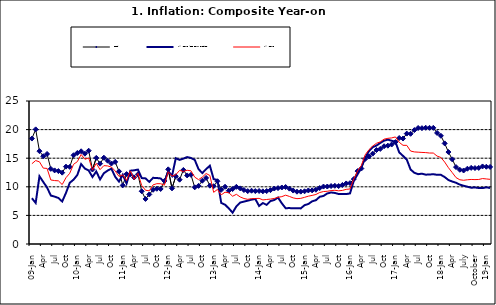
| Category | Food | All Items less Farm Produce | All Items |
|---|---|---|---|
| 09-Jan | 18.436 | 8.013 | 14.034 |
| Feb | 20.041 | 7.178 | 14.584 |
| Mar | 16.233 | 11.842 | 14.366 |
| Apr | 15.342 | 10.85 | 13.268 |
| May | 15.74 | 9.88 | 13.212 |
| June | 13.138 | 8.472 | 11.194 |
| Jul | 12.867 | 8.285 | 11.09 |
| Aug | 12.746 | 8.044 | 11.046 |
| Sep | 12.472 | 7.431 | 10.39 |
| Oct | 13.524 | 8.933 | 11.588 |
| Nov | 13.482 | 10.702 | 12.368 |
| Dec | 15.518 | 11.249 | 13.93 |
| 10-Jan | 15.918 | 12.063 | 14.398 |
| Feb | 16.208 | 13.978 | 15.649 |
| Mar | 15.79 | 13.184 | 14.812 |
| Apr | 16.306 | 12.844 | 15.044 |
| May | 13.023 | 11.711 | 12.915 |
| Jun | 15.053 | 12.686 | 14.099 |
| Jul | 14.043 | 11.287 | 13.002 |
| Aug | 15.09 | 12.366 | 13.702 |
| Sep | 14.57 | 12.83 | 13.65 |
| Oct | 14.065 | 13.168 | 13.45 |
| Nov | 14.351 | 11.746 | 12.766 |
| Dec | 12.701 | 10.917 | 11.815 |
| 11-Jan | 10.255 | 12.118 | 12.08 |
| Feb | 12.221 | 10.569 | 11.1 |
| Mar | 12.169 | 12.815 | 12.779 |
| Apr | 11.629 | 12.882 | 11.291 |
| May | 12.179 | 13.006 | 12.352 |
| Jun | 9.22 | 11.524 | 10.23 |
| Jul | 7.877 | 11.472 | 9.397 |
| Aug | 8.665 | 10.863 | 9.301 |
| Sep | 9.479 | 11.567 | 10.339 |
| Oct | 9.656 | 11.539 | 10.544 |
| Nov | 9.623 | 11.459 | 10.54 |
| Dec | 11.02 | 10.822 | 10.283 |
| 12-Jan | 13.053 | 12.748 | 12.626 |
| 12-Feb | 9.729 | 11.901 | 11.866 |
| 12-Mar | 11.848 | 14.995 | 12.111 |
| Apr | 11.246 | 14.703 | 12.866 |
| May | 12.942 | 14.926 | 12.688 |
| Jun | 11.991 | 15.199 | 12.892 |
| Jul | 12.093 | 15.045 | 12.797 |
| Aug | 9.91 | 14.714 | 11.689 |
| Sep | 10.164 | 13.101 | 11.253 |
| Oct | 11.064 | 12.398 | 11.693 |
| Nov | 11.553 | 13.092 | 12.32 |
| Dec | 10.199 | 13.685 | 11.981 |
| 13-Jan | 10.106 | 11.342 | 9.031 |
| Feb | 10.973 | 11.184 | 9.542 |
| Mar | 9.482 | 7.179 | 8.593 |
| Apr | 10.006 | 6.874 | 9.052 |
| May | 9.321 | 6.227 | 8.964 |
| Jun | 9.606 | 5.472 | 8.353 |
| Jul | 9.994 | 6.58 | 8.682 |
| Aug | 9.723 | 7.245 | 8.231 |
| Sep | 9.437 | 7.41 | 7.952 |
| Oct | 9.249 | 7.579 | 7.807 |
| Nov | 9.313 | 7.75 | 7.931 |
| Dec | 9.253 | 7.872 | 7.957 |
| 14-Jan | 9.271 | 6.648 | 7.977 |
| Feb | 9.207 | 7.166 | 7.707 |
| Mar | 9.254 | 6.836 | 7.783 |
| Apr | 9.414 | 7.508 | 7.851 |
| May | 9.698 | 7.693 | 7.965 |
| Jun | 9.776 | 8.122 | 8.167 |
| Jul | 9.878 | 7.116 | 8.281 |
| Aug | 9.959 | 6.264 | 8.534 |
| Sep | 9.676 | 6.278 | 8.317 |
| Oct | 9.343 | 6.252 | 8.06 |
| Nov | 9.144 | 6.255 | 7.927 |
| Dec | 9.152 | 6.225 | 7.978 |
| 15-Jan | 9.215 | 6.787 | 8.157 |
| Feb | 9.359 | 6.994 | 8.359 |
| Mar | 9.376 | 7.46 | 8.494 |
| Apr | 9.49 | 7.661 | 8.655 |
| May | 9.782 | 8.253 | 9.003 |
| Jun | 10.041 | 8.403 | 9.168 |
| Jul | 10.049 | 8.83 | 9.218 |
| Aug | 10.131 | 9.01 | 9.336 |
| Sep | 10.174 | 8.928 | 9.394 |
| Oct | 10.129 | 8.742 | 9.296 |
| Nov | 10.321 | 8.732 | 9.368 |
| Dec | 10.588 | 8.727 | 9.554 |
| 16-Jan | 10.642 | 8.841 | 9.617 |
| Feb | 11.348 | 11.041 | 11.379 |
| Mar | 12.745 | 12.17 | 12.775 |
| Apr | 13.194 | 13.352 | 13.721 |
| May | 14.861 | 15.054 | 15.577 |
| Jun | 15.302 | 16.224 | 16.48 |
| Jul | 15.799 | 16.929 | 17.127 |
| Aug | 16.427 | 17.208 | 17.609 |
| Sep | 16.622 | 17.666 | 17.852 |
| Oct | 17.09 | 18.067 | 18.33 |
| Nov | 17.191 | 18.241 | 18.476 |
| Dec | 17.388 | 18.052 | 18.547 |
| 17-Jan | 17.818 | 17.867 | 18.719 |
| Feb | 18.528 | 16.011 | 17.78 |
| Mar | 18.436 | 15.404 | 17.256 |
| Apr | 19.303 | 14.75 | 17.244 |
| May | 19.266 | 13.016 | 16.251 |
| Jun | 19.915 | 12.455 | 16.098 |
| Jul | 20.284 | 12.207 | 16.053 |
| Aug | 20.251 | 12.296 | 16.012 |
| Sep | 20.321 | 12.123 | 15.979 |
| Oct | 20.306 | 12.142 | 15.905 |
| Nov | 20.308 | 12.206 | 15.901 |
| Dec | 19.415 | 12.089 | 15.372 |
| 18-Jan | 18.919 | 12.09 | 15.127 |
| Feb | 17.588 | 11.707 | 14.33 |
| Mar | 16.08 | 11.181 | 13.337 |
| Apr | 14.799 | 10.92 | 12.482 |
| May | 13.448 | 10.71 | 11.608 |
| June | 12.977 | 10.387 | 11.231 |
| July | 12.85 | 10.183 | 11.142 |
| August | 13.158 | 10.015 | 11.227 |
| September | 13.309 | 9.838 | 11.284 |
| October | 13.277 | 9.882 | 11.259 |
| November | 13.301 | 9.787 | 11.281 |
| December | 13.559 | 9.771 | 11.442 |
| 19-Jan | 13.505 | 9.91 | 11.374 |
| February | 13.473 | 9.8 | 11.306 |